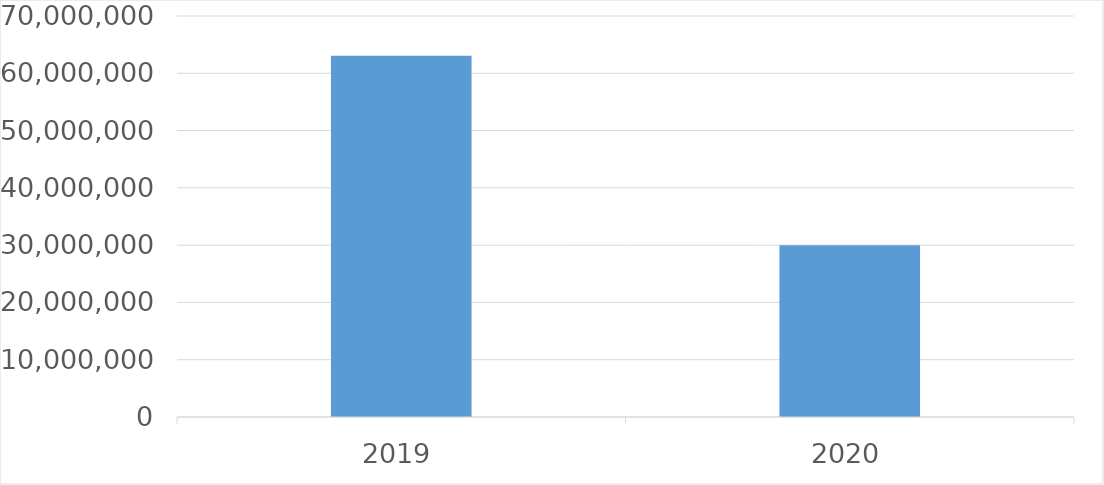
| Category | Series 0 |
|---|---|
| 2019 | 63075063 |
| 2020 | 30000000 |